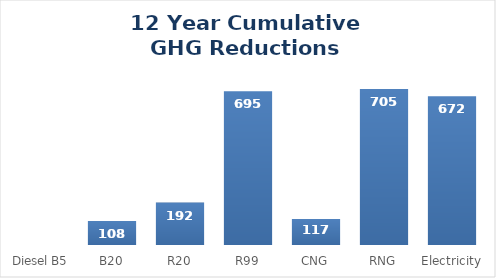
| Category | Series 0 |
|---|---|
| Diesel B5  | 0 |
| B20 | 108.469 |
| R20 | 191.694 |
| R99 | 694.99 |
| CNG | 117.015 |
| RNG | 705.287 |
| Electricity | 671.938 |